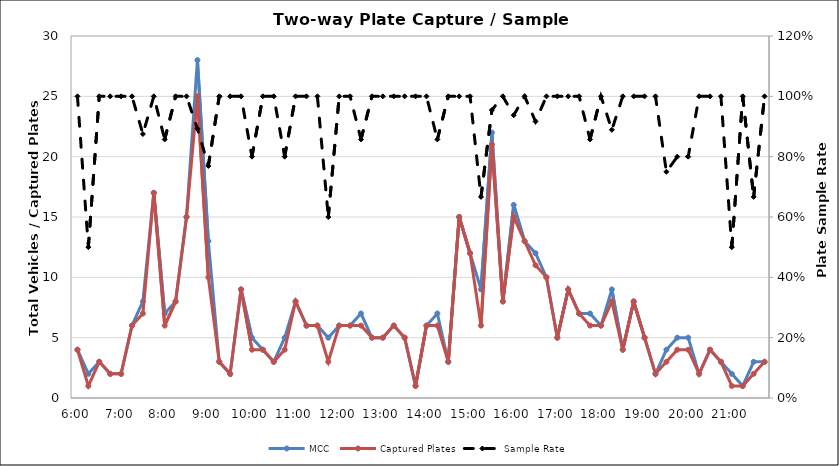
| Category | MCC | Captured Plates |
|---|---|---|
| 0.25 | 4 | 4 |
| 0.260416666666667 | 2 | 1 |
| 0.270833333333333 | 3 | 3 |
| 0.28125 | 2 | 2 |
| 0.291666666666667 | 2 | 2 |
| 0.302083333333333 | 6 | 6 |
| 0.3125 | 8 | 7 |
| 0.322916666666667 | 17 | 17 |
| 0.333333333333333 | 7 | 6 |
| 0.34375 | 8 | 8 |
| 0.354166666666667 | 15 | 15 |
| 0.364583333333333 | 28 | 25 |
| 0.375 | 13 | 10 |
| 0.385416666666667 | 3 | 3 |
| 0.395833333333333 | 2 | 2 |
| 0.40625 | 9 | 9 |
| 0.416666666666667 | 5 | 4 |
| 0.427083333333333 | 4 | 4 |
| 0.4375 | 3 | 3 |
| 0.447916666666667 | 5 | 4 |
| 0.458333333333333 | 8 | 8 |
| 0.46875 | 6 | 6 |
| 0.479166666666667 | 6 | 6 |
| 0.489583333333333 | 5 | 3 |
| 0.5 | 6 | 6 |
| 0.510416666666667 | 6 | 6 |
| 0.520833333333333 | 7 | 6 |
| 0.53125 | 5 | 5 |
| 0.541666666666667 | 5 | 5 |
| 0.552083333333333 | 6 | 6 |
| 0.5625 | 5 | 5 |
| 0.572916666666667 | 1 | 1 |
| 0.583333333333333 | 6 | 6 |
| 0.59375 | 7 | 6 |
| 0.604166666666667 | 3 | 3 |
| 0.614583333333333 | 15 | 15 |
| 0.625 | 12 | 12 |
| 0.635416666666667 | 9 | 6 |
| 0.645833333333333 | 22 | 21 |
| 0.65625 | 8 | 8 |
| 0.666666666666667 | 16 | 15 |
| 0.677083333333333 | 13 | 13 |
| 0.6875 | 12 | 11 |
| 0.697916666666667 | 10 | 10 |
| 0.708333333333333 | 5 | 5 |
| 0.71875 | 9 | 9 |
| 0.729166666666667 | 7 | 7 |
| 0.739583333333333 | 7 | 6 |
| 0.75 | 6 | 6 |
| 0.760416666666667 | 9 | 8 |
| 0.770833333333333 | 4 | 4 |
| 0.78125 | 8 | 8 |
| 0.791666666666667 | 5 | 5 |
| 0.802083333333333 | 2 | 2 |
| 0.8125 | 4 | 3 |
| 0.822916666666667 | 5 | 4 |
| 0.833333333333333 | 5 | 4 |
| 0.84375 | 2 | 2 |
| 0.854166666666667 | 4 | 4 |
| 0.864583333333333 | 3 | 3 |
| 0.875 | 2 | 1 |
| 0.885416666666667 | 1 | 1 |
| 0.895833333333333 | 3 | 2 |
| 0.90625 | 3 | 3 |